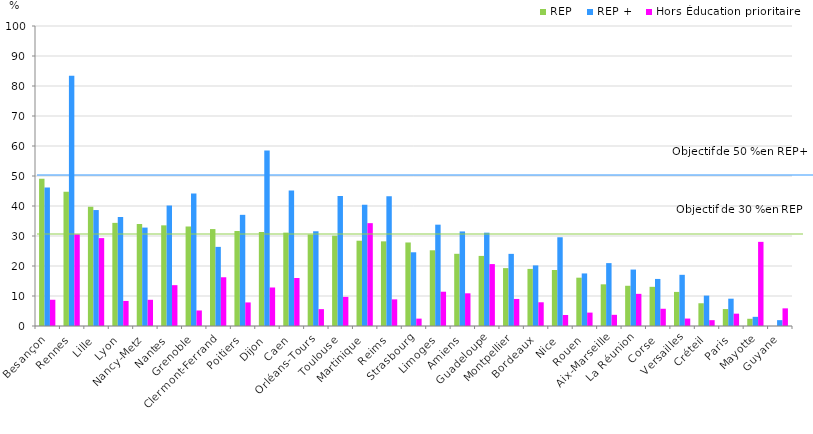
| Category | REP | REP + | Hors Éducation prioritaire |
|---|---|---|---|
| Besançon | 49.123 | 46.198 | 8.748 |
| Rennes | 44.743 | 83.399 | 30.554 |
| Lille | 39.749 | 38.653 | 29.295 |
| Lyon | 34.375 | 36.332 | 8.354 |
| Nancy-Metz | 33.996 | 32.802 | 8.736 |
| Nantes | 33.553 | 40.159 | 13.613 |
| Grenoble | 33.167 | 44.145 | 5.18 |
| Clermont-Ferrand | 32.309 | 26.372 | 16.248 |
| Poitiers | 31.66 | 37.055 | 7.856 |
| Dijon | 31.337 | 58.525 | 12.838 |
| Caen | 31.119 | 45.19 | 16.007 |
| Orléans-Tours | 30.492 | 31.576 | 5.616 |
| Toulouse | 30.115 | 43.296 | 9.71 |
| Martinique | 28.432 | 40.417 | 34.282 |
| Reims | 28.217 | 43.265 | 8.883 |
| Strasbourg | 27.841 | 24.571 | 2.459 |
| Limoges | 25.238 | 33.777 | 11.43 |
| Amiens | 24.064 | 31.519 | 10.896 |
| Guadeloupe | 23.362 | 31.106 | 20.639 |
| Montpellier | 19.298 | 24.045 | 9.013 |
| Bordeaux | 19.032 | 20.199 | 7.907 |
| Nice | 18.675 | 29.578 | 3.666 |
| Rouen | 16.106 | 17.52 | 4.466 |
| Aix-Marseille | 13.888 | 20.965 | 3.723 |
| La Réunion | 13.405 | 18.813 | 10.718 |
| Corse | 13.055 | 15.686 | 5.746 |
| Versailles | 11.358 | 17.061 | 2.481 |
| Créteil | 7.581 | 10.131 | 1.947 |
| Paris | 5.649 | 9.105 | 4.113 |
| Mayotte | 2.407 | 3.054 | 28.05 |
| Guyane | 0 | 1.953 | 5.881 |